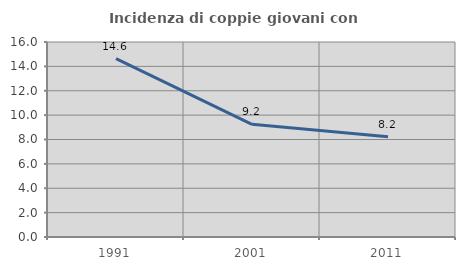
| Category | Incidenza di coppie giovani con figli |
|---|---|
| 1991.0 | 14.629 |
| 2001.0 | 9.246 |
| 2011.0 | 8.231 |